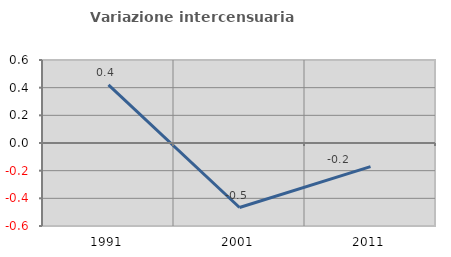
| Category | Variazione intercensuaria annua |
|---|---|
| 1991.0 | 0.42 |
| 2001.0 | -0.466 |
| 2011.0 | -0.17 |